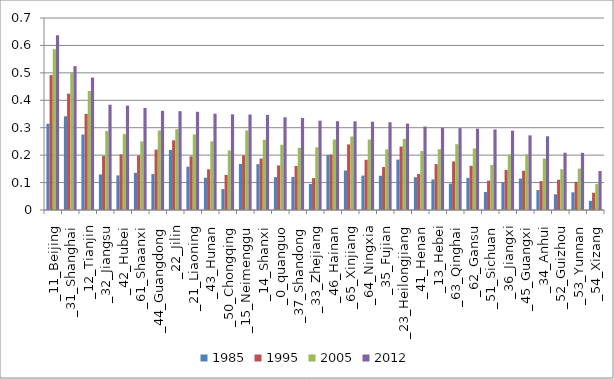
| Category | 1985 | 1995 | 2005 | 2012 |
|---|---|---|---|---|
| _11_Beijing | 0.314 | 0.492 | 0.586 | 0.637 |
| _31_Shanghai | 0.342 | 0.424 | 0.501 | 0.525 |
| _12_Tianjin | 0.275 | 0.35 | 0.434 | 0.483 |
| _32_Jiangsu | 0.13 | 0.197 | 0.288 | 0.384 |
| _42_Hubei | 0.126 | 0.203 | 0.277 | 0.38 |
| _61_Shaanxi | 0.136 | 0.199 | 0.25 | 0.372 |
| _44_Guangdong | 0.131 | 0.22 | 0.29 | 0.362 |
| _22_Jilin | 0.219 | 0.254 | 0.295 | 0.36 |
| _21_Liaoning | 0.158 | 0.196 | 0.275 | 0.358 |
| _43_Hunan | 0.118 | 0.148 | 0.251 | 0.351 |
| _50_Chongqing | 0.076 | 0.128 | 0.217 | 0.349 |
| _15_Neimenggu | 0.168 | 0.199 | 0.29 | 0.348 |
| _14_Shanxi | 0.167 | 0.188 | 0.256 | 0.347 |
| _0_quanguo | 0.12 | 0.163 | 0.238 | 0.338 |
| _37_Shandong | 0.121 | 0.161 | 0.227 | 0.336 |
| _33_Zhejiang | 0.095 | 0.116 | 0.229 | 0.326 |
| _46_Hainan | 0.201 | 0.202 | 0.257 | 0.324 |
| _65_Xinjiang | 0.144 | 0.239 | 0.268 | 0.323 |
| _64_Ningxia | 0.126 | 0.183 | 0.257 | 0.322 |
| _35_Fujian | 0.125 | 0.157 | 0.221 | 0.32 |
| _23_Heilongjiang | 0.184 | 0.231 | 0.26 | 0.315 |
| _41_Henan | 0.12 | 0.131 | 0.215 | 0.304 |
| _13_Hebei | 0.111 | 0.167 | 0.222 | 0.3 |
| _63_Qinghai | 0.096 | 0.177 | 0.24 | 0.299 |
| _62_Gansu | 0.117 | 0.161 | 0.224 | 0.297 |
| _51_Sichuan | 0.065 | 0.107 | 0.164 | 0.294 |
| _36_Jiangxi | 0.102 | 0.146 | 0.202 | 0.29 |
| _45_Guangxi | 0.115 | 0.143 | 0.203 | 0.272 |
| _34_Anhui | 0.073 | 0.105 | 0.187 | 0.269 |
| _52_Guizhou | 0.057 | 0.11 | 0.149 | 0.209 |
| _53_Yunnan | 0.065 | 0.103 | 0.151 | 0.208 |
| _54_Xizang | 0.033 | 0.063 | 0.095 | 0.142 |